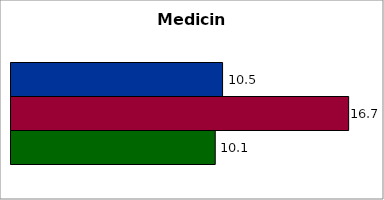
| Category | 50 states and D.C. | SREB states | State |
|---|---|---|---|
| 0 | 10.463 | 16.697 | 10.1 |